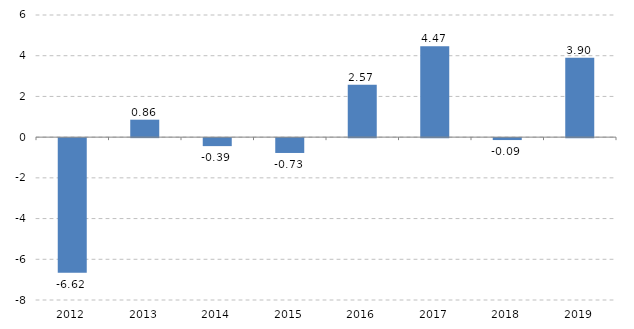
| Category | Series 0 |
|---|---|
| 2012.0 | -6.618 |
| 2013.0 | 0.857 |
| 2014.0 | -0.392 |
| 2015.0 | -0.728 |
| 2016.0 | 2.572 |
| 2017.0 | 4.468 |
| 2018.0 | -0.094 |
| 2019.0 | 3.9 |